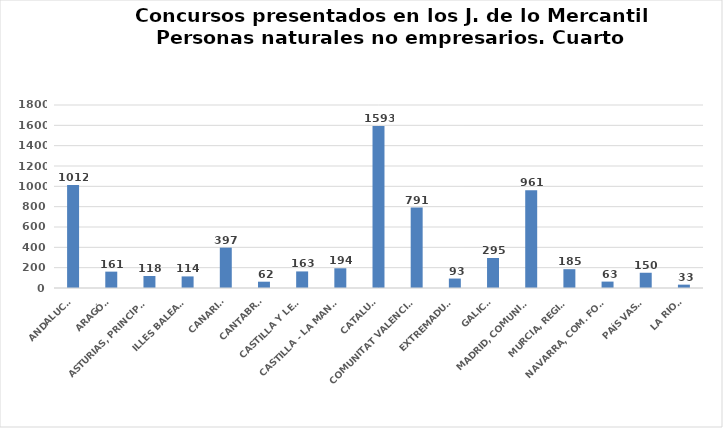
| Category | Series 0 |
|---|---|
| ANDALUCÍA | 1012 |
| ARAGÓN | 161 |
| ASTURIAS, PRINCIPADO | 118 |
| ILLES BALEARS | 114 |
| CANARIAS | 397 |
| CANTABRIA | 62 |
| CASTILLA Y LEÓN | 163 |
| CASTILLA - LA MANCHA | 194 |
| CATALUÑA | 1593 |
| COMUNITAT VALENCIANA | 791 |
| EXTREMADURA | 93 |
| GALICIA | 295 |
| MADRID, COMUNIDAD | 961 |
| MURCIA, REGIÓN | 185 |
| NAVARRA, COM. FORAL | 63 |
| PAÍS VASCO | 150 |
| LA RIOJA | 33 |